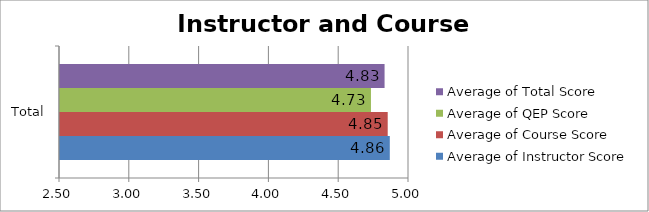
| Category | Average of Instructor Score | Average of Course Score | Average of QEP Score | Average of Total Score |
|---|---|---|---|---|
| Total | 4.862 | 4.848 | 4.728 | 4.825 |